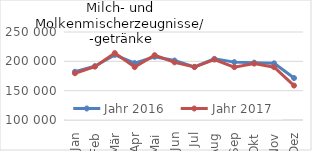
| Category | Jahr 2016 | Jahr 2017 |
|---|---|---|
| Jan | 182237.54 | 179743.437 |
| Feb | 191681.331 | 190995.385 |
| Mär | 210969.108 | 214049.588 |
| Apr | 197010.134 | 190210.944 |
| Mai | 207818.492 | 210510.545 |
| Jun | 201364.666 | 198276.077 |
| Jul | 190618.501 | 190257.385 |
| Aug | 204273.306 | 203022.601 |
| Sep | 198645.576 | 190106.983 |
| Okt | 197695.407 | 196135.811 |
| Nov | 196599.317 | 190033.843 |
| Dez | 171483.951 | 158696.39 |